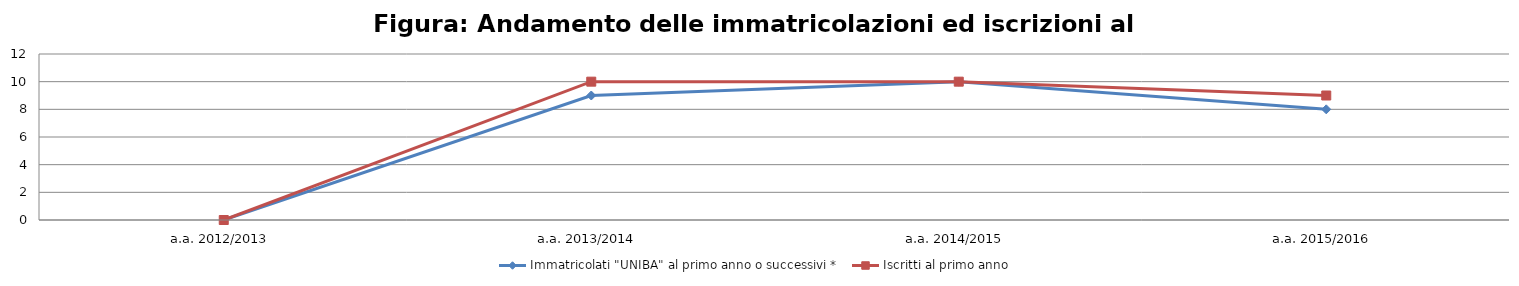
| Category | Immatricolati "UNIBA" al primo anno o successivi * | Iscritti al primo anno  |
|---|---|---|
| a.a. 2012/2013 | 0 | 0 |
| a.a. 2013/2014 | 9 | 10 |
| a.a. 2014/2015 | 10 | 10 |
| a.a. 2015/2016 | 8 | 9 |